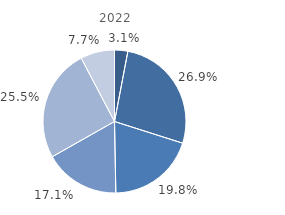
| Category | Series 0 |
|---|---|
| 0 | 3 |
| 1 | 26.9 |
| 2 | 19.8 |
| 3 | 17.1 |
| 4 | 25.5 |
| 5 | 7.7 |